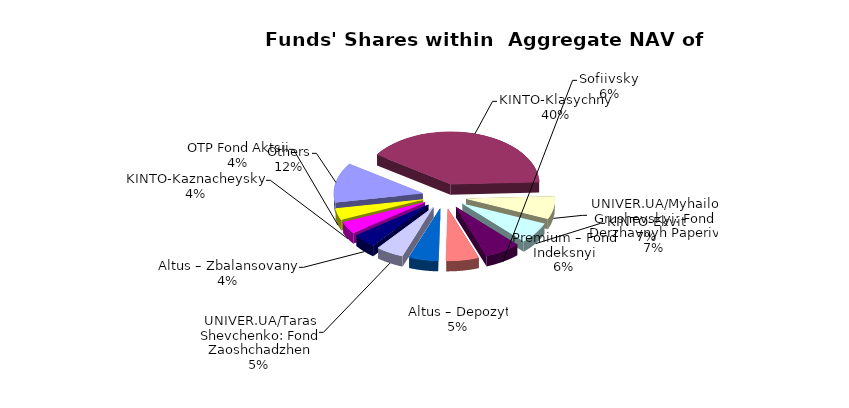
| Category | Series 0 | Series 1 |
|---|---|---|
| Others | 6664903.897 | 0.112 |
| KINTO-Klasychnyi | 21550101.429 | 0.363 |
| UNIVER.UA/Myhailo Grushevskyi: Fond Derzhavnyh Paperiv | 3797353.99 | 0.064 |
| KINTO-Ekviti | 3546487.81 | 0.06 |
| Sofiivskyi | 3517654.96 | 0.059 |
| Premium – Fond Indeksnyi | 3217641.253 | 0.054 |
| Altus – Depozyt | 2890146.74 | 0.049 |
| UNIVER.UA/Taras Shevchenko: Fond Zaoshchadzhen | 2719368.42 | 0.046 |
| Altus – Zbalansovanyi | 2335287.16 | 0.039 |
| KINTO-Kaznacheyskyi | 1986971.74 | 0.033 |
| OTP Fond Aktsii | 1921216.34 | 0.032 |